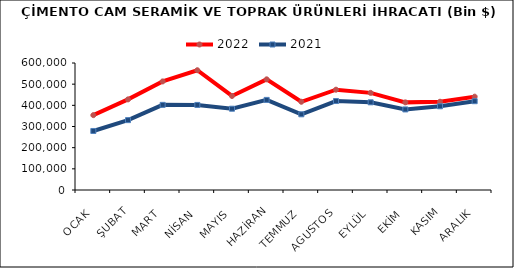
| Category | 2022 | 2021 |
|---|---|---|
| OCAK | 353650.468 | 278859.377 |
| ŞUBAT | 428053.202 | 330049.801 |
| MART | 513024.814 | 402216.037 |
| NİSAN | 565859.136 | 401900.214 |
| MAYIS | 444259.994 | 384005.98 |
| HAZİRAN | 522841.76 | 425640.18 |
| TEMMUZ | 416828.854 | 357592.643 |
| AGUSTOS | 473887.532 | 420352.707 |
| EYLÜL | 458865.907 | 414216.108 |
| EKİM | 413985.504 | 380632.57 |
| KASIM | 416990.564 | 395555.55 |
| ARALIK | 440966.141 | 419566.74 |